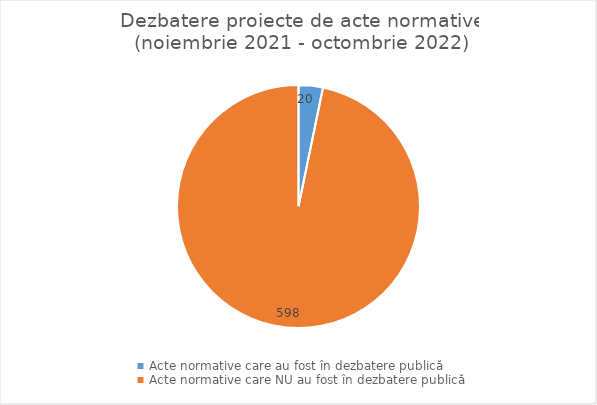
| Category | Series 0 |
|---|---|
| Acte normative care au fost în dezbatere publică | 20 |
| Acte normative care NU au fost în dezbatere publică | 598 |